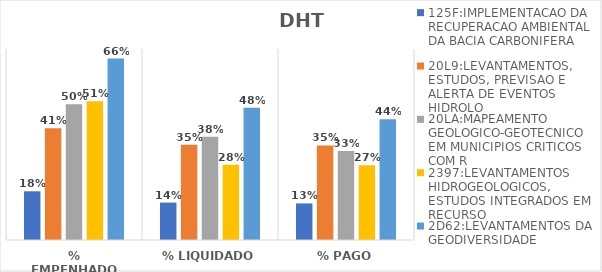
| Category | 125F:IMPLEMENTACAO DA RECUPERACAO AMBIENTAL DA BACIA CARBONIFERA | 20L9:LEVANTAMENTOS, ESTUDOS, PREVISAO E ALERTA DE EVENTOS HIDROLO | 20LA:MAPEAMENTO GEOLOGICO-GEOTECNICO EM MUNICIPIOS CRITICOS COM R | 2397:LEVANTAMENTOS HIDROGEOLOGICOS, ESTUDOS INTEGRADOS EM RECURSO | 2D62:LEVANTAMENTOS DA GEODIVERSIDADE |
|---|---|---|---|---|---|
| % EMPENHADO | 0.179 | 0.41 | 0.497 | 0.509 | 0.665 |
| % LIQUIDADO | 0.137 | 0.349 | 0.378 | 0.276 | 0.485 |
| % PAGO | 0.134 | 0.346 | 0.326 | 0.274 | 0.442 |